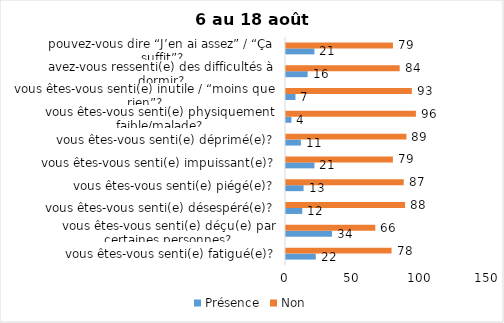
| Category | Présence | Non |
|---|---|---|
| vous êtes-vous senti(e) fatigué(e)? | 22 | 78 |
| vous êtes-vous senti(e) déçu(e) par certaines personnes? | 34 | 66 |
| vous êtes-vous senti(e) désespéré(e)? | 12 | 88 |
| vous êtes-vous senti(e) piégé(e)? | 13 | 87 |
| vous êtes-vous senti(e) impuissant(e)? | 21 | 79 |
| vous êtes-vous senti(e) déprimé(e)? | 11 | 89 |
| vous êtes-vous senti(e) physiquement faible/malade? | 4 | 96 |
| vous êtes-vous senti(e) inutile / “moins que rien”? | 7 | 93 |
| avez-vous ressenti(e) des difficultés à dormir? | 16 | 84 |
| pouvez-vous dire “J’en ai assez” / “Ça suffit”? | 21 | 79 |